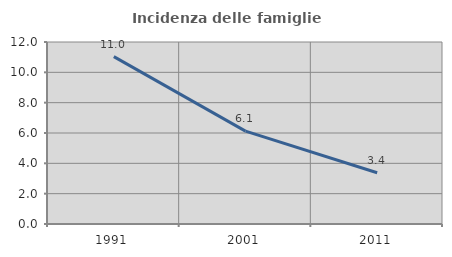
| Category | Incidenza delle famiglie numerose |
|---|---|
| 1991.0 | 11.039 |
| 2001.0 | 6.122 |
| 2011.0 | 3.376 |